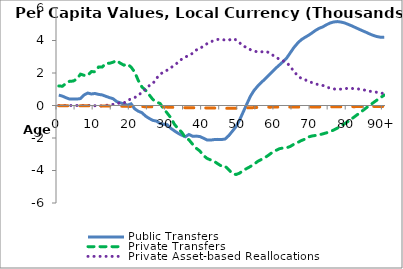
| Category | Public Transfers | Private Transfers | Private Asset-based Reallocations | Public Asset-based Reallocations |
|---|---|---|---|---|
| 0 | 639.34 | 1202.222 | 0.466 | -12.509 |
|  | 576.634 | 1185.889 | 0.974 | -12.424 |
| 2 | 477.948 | 1365.712 | 0.52 | -14.52 |
| 3 | 394.87 | 1492.797 | 0.168 | -15.957 |
| 4 | 406.054 | 1503.25 | -4.729 | -15.891 |
| 5 | 396.46 | 1632.551 | 1.603 | -17.405 |
| 6 | 425.706 | 1928.337 | 0.76 | -20.814 |
| 7 | 648.908 | 1856.35 | 2.075 | -19.756 |
| 8 | 767.441 | 1850.454 | 1.927 | -19.502 |
| 9 | 707.781 | 2088.228 | 16.487 | -22.665 |
| 10 | 739.675 | 2075.788 | -12.992 | -22.298 |
| 11 | 683.95 | 2368.017 | -41.404 | -26.109 |
| 12 | 650.099 | 2364.762 | -15.329 | -26.168 |
| 13 | 567.019 | 2600.864 | 6.739 | -29.598 |
| 14 | 487.329 | 2597.347 | 42.034 | -31.923 |
| 15 | 417.006 | 2661.974 | 68.964 | -35.767 |
| 16 | 243.931 | 2772.774 | 98.355 | -39.778 |
| 17 | 165.569 | 2604.172 | 174.558 | -42.108 |
| 18 | 95.046 | 2483.05 | 151.672 | -45.361 |
| 19 | 24.698 | 2545.123 | 320.963 | -53.683 |
| 20 | 100.259 | 2361.27 | 401.93 | -57.659 |
| 21 | -208.709 | 2053.992 | 485.354 | -60.242 |
| 22 | -353.43 | 1530.413 | 662.776 | -61.791 |
| 23 | -444.347 | 1142.531 | 780.815 | -65.205 |
| 24 | -653.347 | 936.721 | 1004.273 | -73.385 |
| 25 | -795.992 | 658.72 | 1216.868 | -80.952 |
| 26 | -915.189 | 373.174 | 1337.854 | -84.836 |
| 27 | -959.283 | 215.467 | 1665.444 | -89.021 |
| 28 | -1104.875 | 127.97 | 1915.399 | -92.086 |
| 29 | -1150.79 | -205.258 | 2071.25 | -95.279 |
| 30 | -1186.629 | -473.23 | 2174.426 | -100.508 |
| 31 | -1405.077 | -762.004 | 2319.024 | -109.016 |
| 32 | -1564.264 | -1164.062 | 2502.516 | -118.113 |
| 33 | -1710.964 | -1425.261 | 2649.183 | -123.006 |
| 34 | -1825.039 | -1640.171 | 2854.883 | -130.447 |
| 35 | -1924.371 | -1983.156 | 2988.268 | -135.508 |
| 36 | -1782.912 | -2111.206 | 3072.242 | -136.901 |
| 37 | -1892.166 | -2383.739 | 3215.217 | -137.227 |
| 38 | -1883.614 | -2627.256 | 3415.968 | -140.784 |
| 39 | -1909.796 | -2796.799 | 3484.617 | -141.4 |
| 40 | -2010.568 | -3073.179 | 3673.552 | -146.33 |
| 41 | -2120.398 | -3255.355 | 3804.336 | -153.587 |
| 42 | -2129.876 | -3351.328 | 3919.205 | -155.632 |
| 43 | -2095.996 | -3439.822 | 4001.379 | -155.853 |
| 44 | -2084.608 | -3590.965 | 4068.864 | -159.835 |
| 45 | -2097.098 | -3729.881 | 4064.431 | -165.671 |
| 46 | -2060.994 | -3735.578 | 4027.034 | -171.555 |
| 47 | -1856.648 | -3958.624 | 4018.816 | -174.108 |
| 48 | -1583.257 | -4181.421 | 4115.919 | -173.697 |
| 49 | -1303.252 | -4248.343 | 4042.954 | -173.765 |
| 50 | -889.331 | -4163.322 | 3858.71 | -169.376 |
| 51 | -402.626 | -3993.311 | 3655.423 | -159.771 |
| 52 | 88.769 | -3875.698 | 3574.546 | -148.843 |
| 53 | 571.95 | -3753.432 | 3434.549 | -137.794 |
| 54 | 926.367 | -3607.389 | 3353.038 | -128.017 |
| 55 | 1188.36 | -3442.347 | 3296.509 | -119.01 |
| 56 | 1417.003 | -3322.379 | 3296.321 | -111.441 |
| 57 | 1621.651 | -3207.399 | 3335.391 | -105.899 |
| 58 | 1846.353 | -3057.772 | 3270.683 | -102.018 |
| 59 | 2066.643 | -2892.728 | 3118.735 | -99.151 |
| 60 | 2291.472 | -2771.025 | 2991.187 | -96.934 |
| 61 | 2491.142 | -2660.027 | 2842.745 | -95.934 |
| 62 | 2692.727 | -2616.091 | 2748.043 | -95.428 |
| 63 | 2910.735 | -2603.035 | 2644.796 | -95.875 |
| 64 | 3234.945 | -2521.462 | 2410.004 | -95.499 |
| 65 | 3559.755 | -2386.849 | 2102.472 | -94.7 |
| 66 | 3821.209 | -2284.909 | 1856.568 | -93.819 |
| 67 | 4038.73 | -2166.793 | 1672.632 | -92.437 |
| 68 | 4181.438 | -2075.614 | 1604.393 | -91.166 |
| 69 | 4311.278 | -1938.089 | 1476.192 | -90.081 |
| 70 | 4460.199 | -1877.851 | 1414.898 | -89.468 |
| 71 | 4618.747 | -1841.696 | 1331.744 | -89.192 |
| 72 | 4750.306 | -1805.874 | 1267.076 | -88.24 |
| 73 | 4835.716 | -1748.034 | 1235.195 | -87.026 |
| 74 | 4965.38 | -1682.717 | 1150.763 | -85.497 |
| 75 | 5073.075 | -1606.35 | 1067.557 | -84.043 |
| 76 | 5138.666 | -1513.449 | 1020.401 | -82.278 |
| 77 | 5163.987 | -1397.242 | 996.992 | -80.034 |
| 78 | 5137.68 | -1265.107 | 1007.746 | -77.633 |
| 79 | 5084.445 | -1128.365 | 1030.495 | -75.276 |
| 80 | 4996.303 | -981.608 | 1057.453 | -73.094 |
| 81 | 4904.736 | -823.86 | 1049.003 | -71.039 |
| 82 | 4801.262 | -656.891 | 1031.831 | -69.25 |
| 83 | 4699.194 | -490.15 | 1012.33 | -67.48 |
| 84 | 4600.444 | -325.128 | 986.235 | -65.763 |
| 85 | 4505.135 | -151.744 | 917.713 | -64.188 |
| 86 | 4401.322 | 14.413 | 876.361 | -62.619 |
| 87 | 4311.337 | 176.136 | 846.84 | -61.093 |
| 88 | 4241.777 | 333.192 | 812.943 | -59.82 |
| 89 | 4201.127 | 486.235 | 784.219 | -58.642 |
| 90+ | 4191.648 | 636.738 | 709.523 | -58.557 |